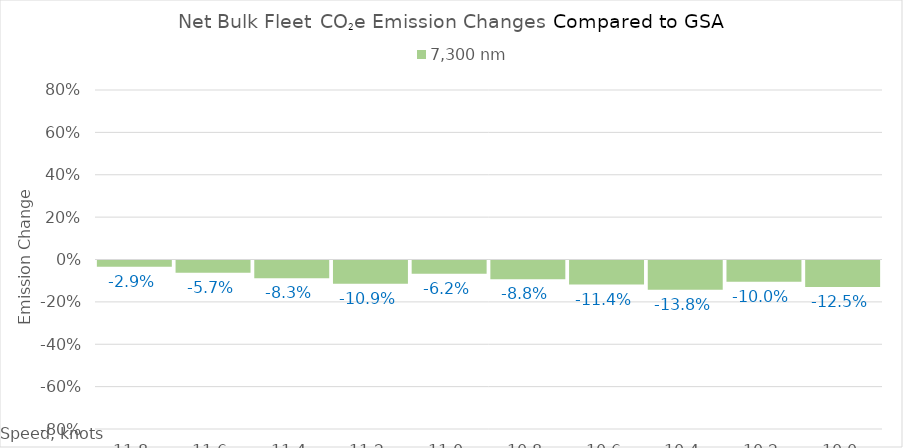
| Category | 7,300 |
|---|---|
| 11.8 | -0.029 |
| 11.600000000000001 | -0.057 |
| 11.400000000000002 | -0.083 |
| 11.200000000000003 | -0.109 |
| 11.000000000000004 | -0.062 |
| 10.800000000000004 | -0.088 |
| 10.600000000000005 | -0.114 |
| 10.400000000000006 | -0.138 |
| 10.200000000000006 | -0.1 |
| 10.000000000000007 | -0.125 |